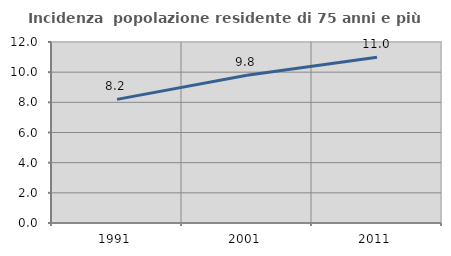
| Category | Incidenza  popolazione residente di 75 anni e più |
|---|---|
| 1991.0 | 8.195 |
| 2001.0 | 9.802 |
| 2011.0 | 10.989 |